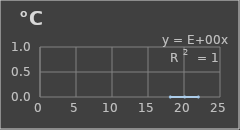
| Category | Temperatura |
|---|---|
| 18.1 | 0 |
| 20.1 | 0 |
| 22.0 | 0 |